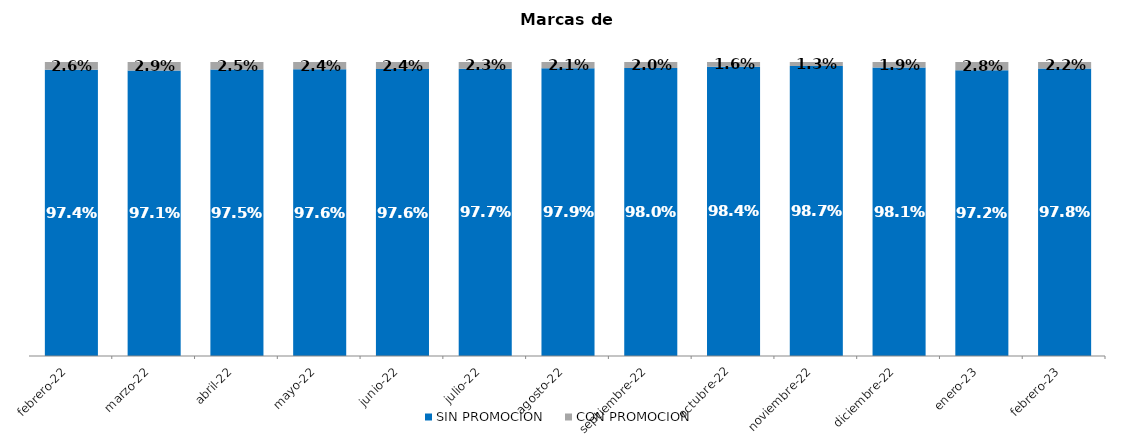
| Category | SIN PROMOCION   | CON PROMOCION   |
|---|---|---|
| 2022-02-01 | 0.974 | 0.026 |
| 2022-03-01 | 0.971 | 0.029 |
| 2022-04-01 | 0.975 | 0.025 |
| 2022-05-01 | 0.976 | 0.024 |
| 2022-06-01 | 0.976 | 0.024 |
| 2022-07-01 | 0.977 | 0.023 |
| 2022-08-01 | 0.979 | 0.021 |
| 2022-09-01 | 0.98 | 0.02 |
| 2022-10-01 | 0.984 | 0.016 |
| 2022-11-01 | 0.987 | 0.013 |
| 2022-12-01 | 0.981 | 0.019 |
| 2023-01-01 | 0.972 | 0.028 |
| 2023-02-01 | 0.978 | 0.022 |